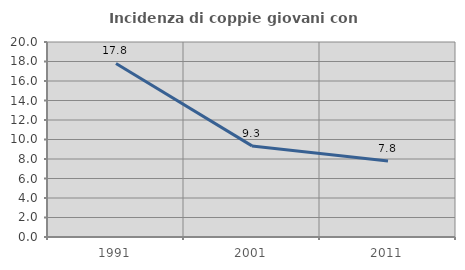
| Category | Incidenza di coppie giovani con figli |
|---|---|
| 1991.0 | 17.804 |
| 2001.0 | 9.344 |
| 2011.0 | 7.785 |